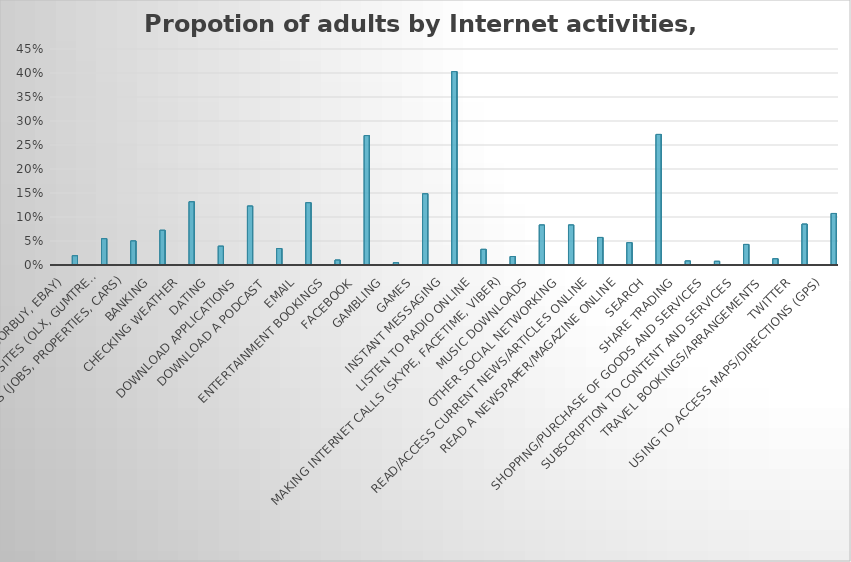
| Category | Series 0 | Series 1 | Series 2 | Series 3 | Series 4 |
|---|---|---|---|---|---|
| Access auction websites (BidorBuy, eBay) |  |  |  |  | 0.019 |
| Access classified advertising websites (OLX, Gumtree) |  |  |  |  | 0.055 |
| Access listing sites (jobs, properties, cars) |  |  |  |  | 0.05 |
| Banking |  |  |  |  | 0.072 |
| Checking weather |  |  |  |  | 0.132 |
| Dating |  |  |  |  | 0.039 |
| Download applications |  |  |  |  | 0.123 |
| Download a podcast |  |  |  |  | 0.034 |
| Email |  |  |  |  | 0.13 |
| Entertainment bookings |  |  |  |  | 0.01 |
| Facebook |  |  |  |  | 0.27 |
| Gambling |  |  |  |  | 0.005 |
| Games |  |  |  |  | 0.148 |
| Instant messaging |  |  |  |  | 0.403 |
| Listen to radio online |  |  |  |  | 0.033 |
| Making internet calls (Skype, Facetime, Viber) |  |  |  |  | 0.018 |
| Music downloads |  |  |  |  | 0.083 |
| Other social networking |  |  |  |  | 0.083 |
| Read/access current news/articles online |  |  |  |  | 0.057 |
| Read a newspaper/magazine online |  |  |  |  | 0.047 |
| Search |  |  |  |  | 0.272 |
| Share trading |  |  |  |  | 0.008 |
| Shopping/purchase of goods and services |  |  |  |  | 0.008 |
| Subscription to content and services |  |  |  |  | 0.043 |
| Travel bookings/arrangements |  |  |  |  | 0.013 |
| Twitter |  |  |  |  | 0.085 |
| Using to access maps/directions (GPS) |  |  |  |  | 0.107 |